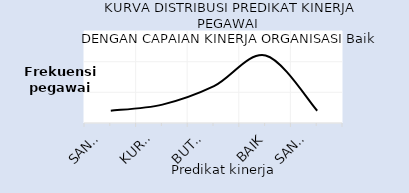
| Category | Series 0 |
|---|---|
| Sangat 
Kurang | 2 |
| Kurang/
Misconduct | 3 |
| Butuh 
Perbaikan | 6 |
| Baik | 11 |
| Sangat 
Baik | 2 |